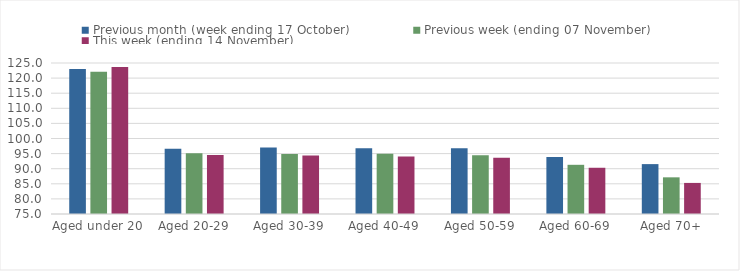
| Category | Previous month (week ending 17 October) | Previous week (ending 07 November) | This week (ending 14 November) |
|---|---|---|---|
| Aged under 20 | 123.02 | 122.08 | 123.69 |
| Aged 20-29 | 96.63 | 95.09 | 94.5 |
| Aged 30-39 | 97.01 | 94.86 | 94.34 |
| Aged 40-49 | 96.77 | 94.95 | 94.06 |
| Aged 50-59 | 96.78 | 94.44 | 93.64 |
| Aged 60-69 | 93.89 | 91.29 | 90.31 |
| Aged 70+ | 91.52 | 87.14 | 85.29 |